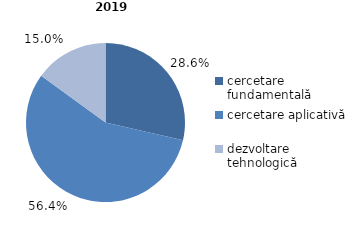
| Category | Series 0 |
|---|---|
| cercetare fundamentală | 28.6 |
| cercetare aplicativă | 56.4 |
| dezvoltare tehnologică  | 15 |